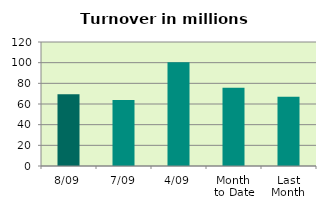
| Category | Series 0 |
|---|---|
| 8/09 | 69.476 |
| 7/09 | 63.989 |
| 4/09 | 100.326 |
| Month 
to Date | 75.759 |
| Last
Month | 66.948 |